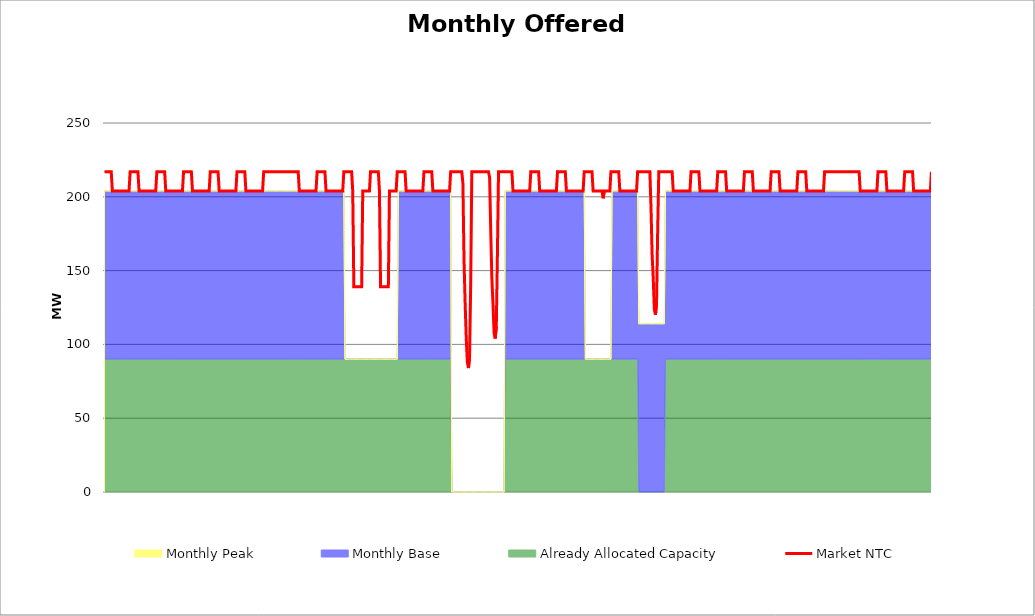
| Category | Market NTC |
|---|---|
| 0 | 217 |
| 1 | 217 |
| 2 | 217 |
| 3 | 217 |
| 4 | 217 |
| 5 | 217 |
| 6 | 217 |
| 7 | 204 |
| 8 | 204 |
| 9 | 204 |
| 10 | 204 |
| 11 | 204 |
| 12 | 204 |
| 13 | 204 |
| 14 | 204 |
| 15 | 204 |
| 16 | 204 |
| 17 | 204 |
| 18 | 204 |
| 19 | 204 |
| 20 | 204 |
| 21 | 204 |
| 22 | 204 |
| 23 | 217 |
| 24 | 217 |
| 25 | 217 |
| 26 | 217 |
| 27 | 217 |
| 28 | 217 |
| 29 | 217 |
| 30 | 217 |
| 31 | 204 |
| 32 | 204 |
| 33 | 204 |
| 34 | 204 |
| 35 | 204 |
| 36 | 204 |
| 37 | 204 |
| 38 | 204 |
| 39 | 204 |
| 40 | 204 |
| 41 | 204 |
| 42 | 204 |
| 43 | 204 |
| 44 | 204 |
| 45 | 204 |
| 46 | 204 |
| 47 | 217 |
| 48 | 217 |
| 49 | 217 |
| 50 | 217 |
| 51 | 217 |
| 52 | 217 |
| 53 | 217 |
| 54 | 217 |
| 55 | 204 |
| 56 | 204 |
| 57 | 204 |
| 58 | 204 |
| 59 | 204 |
| 60 | 204 |
| 61 | 204 |
| 62 | 204 |
| 63 | 204 |
| 64 | 204 |
| 65 | 204 |
| 66 | 204 |
| 67 | 204 |
| 68 | 204 |
| 69 | 204 |
| 70 | 204 |
| 71 | 217 |
| 72 | 217 |
| 73 | 217 |
| 74 | 217 |
| 75 | 217 |
| 76 | 217 |
| 77 | 217 |
| 78 | 217 |
| 79 | 204 |
| 80 | 204 |
| 81 | 204 |
| 82 | 204 |
| 83 | 204 |
| 84 | 204 |
| 85 | 204 |
| 86 | 204 |
| 87 | 204 |
| 88 | 204 |
| 89 | 204 |
| 90 | 204 |
| 91 | 204 |
| 92 | 204 |
| 93 | 204 |
| 94 | 204 |
| 95 | 217 |
| 96 | 217 |
| 97 | 217 |
| 98 | 217 |
| 99 | 217 |
| 100 | 217 |
| 101 | 217 |
| 102 | 217 |
| 103 | 204 |
| 104 | 204 |
| 105 | 204 |
| 106 | 204 |
| 107 | 204 |
| 108 | 204 |
| 109 | 204 |
| 110 | 204 |
| 111 | 204 |
| 112 | 204 |
| 113 | 204 |
| 114 | 204 |
| 115 | 204 |
| 116 | 204 |
| 117 | 204 |
| 118 | 204 |
| 119 | 217 |
| 120 | 217 |
| 121 | 217 |
| 122 | 217 |
| 123 | 217 |
| 124 | 217 |
| 125 | 217 |
| 126 | 217 |
| 127 | 204 |
| 128 | 204 |
| 129 | 204 |
| 130 | 204 |
| 131 | 204 |
| 132 | 204 |
| 133 | 204 |
| 134 | 204 |
| 135 | 204 |
| 136 | 204 |
| 137 | 204 |
| 138 | 204 |
| 139 | 204 |
| 140 | 204 |
| 141 | 204 |
| 142 | 204 |
| 143 | 217 |
| 144 | 217 |
| 145 | 217 |
| 146 | 217 |
| 147 | 217 |
| 148 | 217 |
| 149 | 217 |
| 150 | 217 |
| 151 | 217 |
| 152 | 217 |
| 153 | 217 |
| 154 | 217 |
| 155 | 217 |
| 156 | 217 |
| 157 | 217 |
| 158 | 217 |
| 159 | 217 |
| 160 | 217 |
| 161 | 217 |
| 162 | 217 |
| 163 | 217 |
| 164 | 217 |
| 165 | 217 |
| 166 | 217 |
| 167 | 217 |
| 168 | 217 |
| 169 | 217 |
| 170 | 217 |
| 171 | 217 |
| 172 | 217 |
| 173 | 217 |
| 174 | 217 |
| 175 | 204 |
| 176 | 204 |
| 177 | 204 |
| 178 | 204 |
| 179 | 204 |
| 180 | 204 |
| 181 | 204 |
| 182 | 204 |
| 183 | 204 |
| 184 | 204 |
| 185 | 204 |
| 186 | 204 |
| 187 | 204 |
| 188 | 204 |
| 189 | 204 |
| 190 | 204 |
| 191 | 217 |
| 192 | 217 |
| 193 | 217 |
| 194 | 217 |
| 195 | 217 |
| 196 | 217 |
| 197 | 217 |
| 198 | 217 |
| 199 | 204 |
| 200 | 204 |
| 201 | 204 |
| 202 | 204 |
| 203 | 204 |
| 204 | 204 |
| 205 | 204 |
| 206 | 204 |
| 207 | 204 |
| 208 | 204 |
| 209 | 204 |
| 210 | 204 |
| 211 | 204 |
| 212 | 204 |
| 213 | 204 |
| 214 | 204 |
| 215 | 217 |
| 216 | 217 |
| 217 | 217 |
| 218 | 217 |
| 219 | 217 |
| 220 | 217 |
| 221 | 217 |
| 222 | 217 |
| 223 | 204 |
| 224 | 139 |
| 225 | 139 |
| 226 | 139 |
| 227 | 139 |
| 228 | 139 |
| 229 | 139 |
| 230 | 139 |
| 231 | 139 |
| 232 | 204 |
| 233 | 204 |
| 234 | 204 |
| 235 | 204 |
| 236 | 204 |
| 237 | 204 |
| 238 | 204 |
| 239 | 217 |
| 240 | 217 |
| 241 | 217 |
| 242 | 217 |
| 243 | 217 |
| 244 | 217 |
| 245 | 217 |
| 246 | 217 |
| 247 | 204 |
| 248 | 139 |
| 249 | 139 |
| 250 | 139 |
| 251 | 139 |
| 252 | 139 |
| 253 | 139 |
| 254 | 139 |
| 255 | 139 |
| 256 | 204 |
| 257 | 204 |
| 258 | 204 |
| 259 | 204 |
| 260 | 204 |
| 261 | 204 |
| 262 | 204 |
| 263 | 217 |
| 264 | 217 |
| 265 | 217 |
| 266 | 217 |
| 267 | 217 |
| 268 | 217 |
| 269 | 217 |
| 270 | 217 |
| 271 | 204 |
| 272 | 204 |
| 273 | 204 |
| 274 | 204 |
| 275 | 204 |
| 276 | 204 |
| 277 | 204 |
| 278 | 204 |
| 279 | 204 |
| 280 | 204 |
| 281 | 204 |
| 282 | 204 |
| 283 | 204 |
| 284 | 204 |
| 285 | 204 |
| 286 | 204 |
| 287 | 217 |
| 288 | 217 |
| 289 | 217 |
| 290 | 217 |
| 291 | 217 |
| 292 | 217 |
| 293 | 217 |
| 294 | 217 |
| 295 | 204 |
| 296 | 204 |
| 297 | 204 |
| 298 | 204 |
| 299 | 204 |
| 300 | 204 |
| 301 | 204 |
| 302 | 204 |
| 303 | 204 |
| 304 | 204 |
| 305 | 204 |
| 306 | 204 |
| 307 | 204 |
| 308 | 204 |
| 309 | 204 |
| 310 | 204 |
| 311 | 217 |
| 312 | 217 |
| 313 | 217 |
| 314 | 217 |
| 315 | 217 |
| 316 | 217 |
| 317 | 217 |
| 318 | 217 |
| 319 | 217 |
| 320 | 217 |
| 321 | 217 |
| 322 | 209 |
| 323 | 157 |
| 324 | 128 |
| 325 | 104 |
| 326 | 88 |
| 327 | 84 |
| 328 | 92 |
| 329 | 141 |
| 330 | 217 |
| 331 | 217 |
| 332 | 217 |
| 333 | 217 |
| 334 | 217 |
| 335 | 217 |
| 336 | 217 |
| 337 | 217 |
| 338 | 217 |
| 339 | 217 |
| 340 | 217 |
| 341 | 217 |
| 342 | 217 |
| 343 | 217 |
| 344 | 217 |
| 345 | 217 |
| 346 | 213 |
| 347 | 177 |
| 348 | 145 |
| 349 | 128 |
| 350 | 108 |
| 351 | 104 |
| 352 | 112 |
| 353 | 161 |
| 354 | 217 |
| 355 | 217 |
| 356 | 217 |
| 357 | 217 |
| 358 | 217 |
| 359 | 217 |
| 360 | 217 |
| 361 | 217 |
| 362 | 217 |
| 363 | 217 |
| 364 | 217 |
| 365 | 217 |
| 366 | 217 |
| 367 | 204 |
| 368 | 204 |
| 369 | 204 |
| 370 | 204 |
| 371 | 204 |
| 372 | 204 |
| 373 | 204 |
| 374 | 204 |
| 375 | 204 |
| 376 | 204 |
| 377 | 204 |
| 378 | 204 |
| 379 | 204 |
| 380 | 204 |
| 381 | 204 |
| 382 | 204 |
| 383 | 217 |
| 384 | 217 |
| 385 | 217 |
| 386 | 217 |
| 387 | 217 |
| 388 | 217 |
| 389 | 217 |
| 390 | 217 |
| 391 | 204 |
| 392 | 204 |
| 393 | 204 |
| 394 | 204 |
| 395 | 204 |
| 396 | 204 |
| 397 | 204 |
| 398 | 204 |
| 399 | 204 |
| 400 | 204 |
| 401 | 204 |
| 402 | 204 |
| 403 | 204 |
| 404 | 204 |
| 405 | 204 |
| 406 | 204 |
| 407 | 217 |
| 408 | 217 |
| 409 | 217 |
| 410 | 217 |
| 411 | 217 |
| 412 | 217 |
| 413 | 217 |
| 414 | 217 |
| 415 | 204 |
| 416 | 204 |
| 417 | 204 |
| 418 | 204 |
| 419 | 204 |
| 420 | 204 |
| 421 | 204 |
| 422 | 204 |
| 423 | 204 |
| 424 | 204 |
| 425 | 204 |
| 426 | 204 |
| 427 | 204 |
| 428 | 204 |
| 429 | 204 |
| 430 | 204 |
| 431 | 217 |
| 432 | 217 |
| 433 | 217 |
| 434 | 217 |
| 435 | 217 |
| 436 | 217 |
| 437 | 217 |
| 438 | 217 |
| 439 | 204 |
| 440 | 204 |
| 441 | 204 |
| 442 | 204 |
| 443 | 204 |
| 444 | 204 |
| 445 | 204 |
| 446 | 204 |
| 447 | 204 |
| 448 | 199 |
| 449 | 204 |
| 450 | 204 |
| 451 | 204 |
| 452 | 204 |
| 453 | 204 |
| 454 | 204 |
| 455 | 217 |
| 456 | 217 |
| 457 | 217 |
| 458 | 217 |
| 459 | 217 |
| 460 | 217 |
| 461 | 217 |
| 462 | 217 |
| 463 | 204 |
| 464 | 204 |
| 465 | 204 |
| 466 | 204 |
| 467 | 204 |
| 468 | 204 |
| 469 | 204 |
| 470 | 204 |
| 471 | 204 |
| 472 | 204 |
| 473 | 204 |
| 474 | 204 |
| 475 | 204 |
| 476 | 204 |
| 477 | 204 |
| 478 | 204 |
| 479 | 217 |
| 480 | 217 |
| 481 | 217 |
| 482 | 217 |
| 483 | 217 |
| 484 | 217 |
| 485 | 217 |
| 486 | 217 |
| 487 | 217 |
| 488 | 217 |
| 489 | 217 |
| 490 | 217 |
| 491 | 193 |
| 492 | 161 |
| 493 | 145 |
| 494 | 124 |
| 495 | 120 |
| 496 | 128 |
| 497 | 177 |
| 498 | 217 |
| 499 | 217 |
| 500 | 217 |
| 501 | 217 |
| 502 | 217 |
| 503 | 217 |
| 504 | 217 |
| 505 | 217 |
| 506 | 217 |
| 507 | 217 |
| 508 | 217 |
| 509 | 217 |
| 510 | 217 |
| 511 | 204 |
| 512 | 204 |
| 513 | 204 |
| 514 | 204 |
| 515 | 204 |
| 516 | 204 |
| 517 | 204 |
| 518 | 204 |
| 519 | 204 |
| 520 | 204 |
| 521 | 204 |
| 522 | 204 |
| 523 | 204 |
| 524 | 204 |
| 525 | 204 |
| 526 | 204 |
| 527 | 217 |
| 528 | 217 |
| 529 | 217 |
| 530 | 217 |
| 531 | 217 |
| 532 | 217 |
| 533 | 217 |
| 534 | 217 |
| 535 | 204 |
| 536 | 204 |
| 537 | 204 |
| 538 | 204 |
| 539 | 204 |
| 540 | 204 |
| 541 | 204 |
| 542 | 204 |
| 543 | 204 |
| 544 | 204 |
| 545 | 204 |
| 546 | 204 |
| 547 | 204 |
| 548 | 204 |
| 549 | 204 |
| 550 | 204 |
| 551 | 217 |
| 552 | 217 |
| 553 | 217 |
| 554 | 217 |
| 555 | 217 |
| 556 | 217 |
| 557 | 217 |
| 558 | 217 |
| 559 | 204 |
| 560 | 204 |
| 561 | 204 |
| 562 | 204 |
| 563 | 204 |
| 564 | 204 |
| 565 | 204 |
| 566 | 204 |
| 567 | 204 |
| 568 | 204 |
| 569 | 204 |
| 570 | 204 |
| 571 | 204 |
| 572 | 204 |
| 573 | 204 |
| 574 | 204 |
| 575 | 217 |
| 576 | 217 |
| 577 | 217 |
| 578 | 217 |
| 579 | 217 |
| 580 | 217 |
| 581 | 217 |
| 582 | 217 |
| 583 | 204 |
| 584 | 204 |
| 585 | 204 |
| 586 | 204 |
| 587 | 204 |
| 588 | 204 |
| 589 | 204 |
| 590 | 204 |
| 591 | 204 |
| 592 | 204 |
| 593 | 204 |
| 594 | 204 |
| 595 | 204 |
| 596 | 204 |
| 597 | 204 |
| 598 | 204 |
| 599 | 217 |
| 600 | 217 |
| 601 | 217 |
| 602 | 217 |
| 603 | 217 |
| 604 | 217 |
| 605 | 217 |
| 606 | 217 |
| 607 | 204 |
| 608 | 204 |
| 609 | 204 |
| 610 | 204 |
| 611 | 204 |
| 612 | 204 |
| 613 | 204 |
| 614 | 204 |
| 615 | 204 |
| 616 | 204 |
| 617 | 204 |
| 618 | 204 |
| 619 | 204 |
| 620 | 204 |
| 621 | 204 |
| 622 | 204 |
| 623 | 217 |
| 624 | 217 |
| 625 | 217 |
| 626 | 217 |
| 627 | 217 |
| 628 | 217 |
| 629 | 217 |
| 630 | 217 |
| 631 | 204 |
| 632 | 204 |
| 633 | 204 |
| 634 | 204 |
| 635 | 204 |
| 636 | 204 |
| 637 | 204 |
| 638 | 204 |
| 639 | 204 |
| 640 | 204 |
| 641 | 204 |
| 642 | 204 |
| 643 | 204 |
| 644 | 204 |
| 645 | 204 |
| 646 | 204 |
| 647 | 217 |
| 648 | 217 |
| 649 | 217 |
| 650 | 217 |
| 651 | 217 |
| 652 | 217 |
| 653 | 217 |
| 654 | 217 |
| 655 | 217 |
| 656 | 217 |
| 657 | 217 |
| 658 | 217 |
| 659 | 217 |
| 660 | 217 |
| 661 | 217 |
| 662 | 217 |
| 663 | 217 |
| 664 | 217 |
| 665 | 217 |
| 666 | 217 |
| 667 | 217 |
| 668 | 217 |
| 669 | 217 |
| 670 | 217 |
| 671 | 217 |
| 672 | 217 |
| 673 | 217 |
| 674 | 217 |
| 675 | 217 |
| 676 | 217 |
| 677 | 217 |
| 678 | 217 |
| 679 | 204 |
| 680 | 204 |
| 681 | 204 |
| 682 | 204 |
| 683 | 204 |
| 684 | 204 |
| 685 | 204 |
| 686 | 204 |
| 687 | 204 |
| 688 | 204 |
| 689 | 204 |
| 690 | 204 |
| 691 | 204 |
| 692 | 204 |
| 693 | 204 |
| 694 | 204 |
| 695 | 217 |
| 696 | 217 |
| 697 | 217 |
| 698 | 217 |
| 699 | 217 |
| 700 | 217 |
| 701 | 217 |
| 702 | 217 |
| 703 | 204 |
| 704 | 204 |
| 705 | 204 |
| 706 | 204 |
| 707 | 204 |
| 708 | 204 |
| 709 | 204 |
| 710 | 204 |
| 711 | 204 |
| 712 | 204 |
| 713 | 204 |
| 714 | 204 |
| 715 | 204 |
| 716 | 204 |
| 717 | 204 |
| 718 | 204 |
| 719 | 217 |
| 720 | 217 |
| 721 | 217 |
| 722 | 217 |
| 723 | 217 |
| 724 | 217 |
| 725 | 217 |
| 726 | 217 |
| 727 | 204 |
| 728 | 204 |
| 729 | 204 |
| 730 | 204 |
| 731 | 204 |
| 732 | 204 |
| 733 | 204 |
| 734 | 204 |
| 735 | 204 |
| 736 | 204 |
| 737 | 204 |
| 738 | 204 |
| 739 | 204 |
| 740 | 204 |
| 741 | 204 |
| 742 | 204 |
| 743 | 217 |